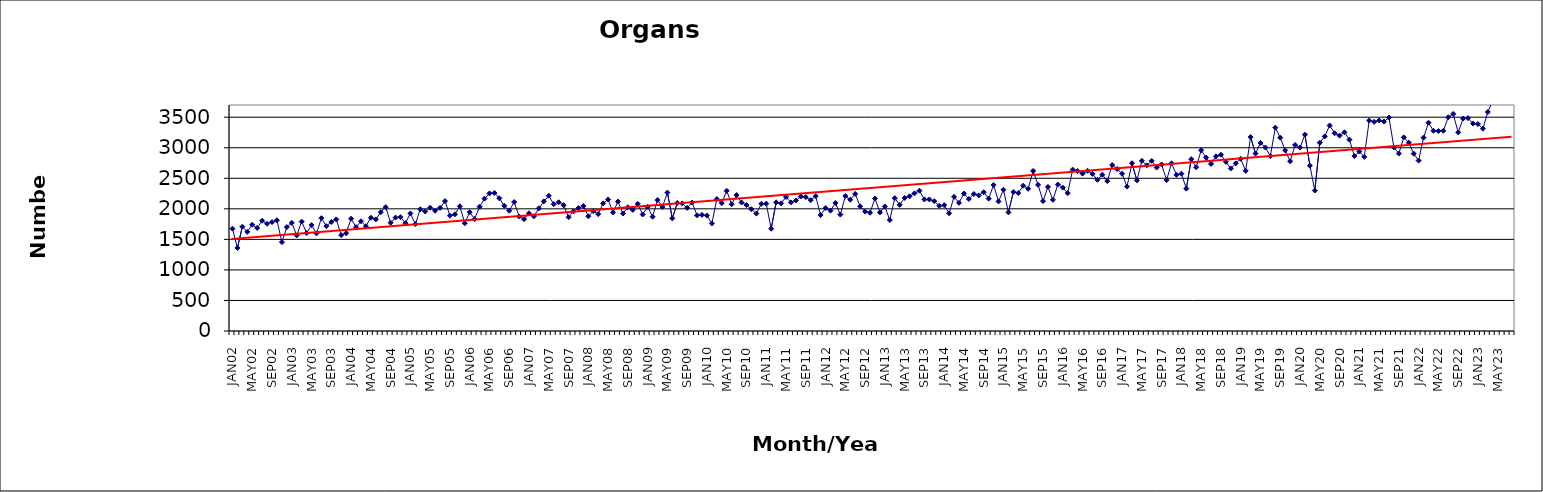
| Category | Series 0 |
|---|---|
| JAN02 | 1675 |
| FEB02 | 1360 |
| MAR02 | 1708 |
| APR02 | 1623 |
| MAY02 | 1740 |
| JUN02 | 1687 |
| JUL02 | 1806 |
| AUG02 | 1755 |
| SEP02 | 1783 |
| OCT02 | 1813 |
| NOV02 | 1455 |
| DEC02 | 1701 |
| JAN03 | 1770 |
| FEB03 | 1565 |
| MAR03 | 1791 |
| APR03 | 1603 |
| MAY03 | 1734 |
| JUN03 | 1598 |
| JUL03 | 1847 |
| AUG03 | 1716 |
| SEP03 | 1785 |
| OCT03 | 1827 |
| NOV03 | 1570 |
| DEC03 | 1602 |
| JAN04 | 1839 |
| FEB04 | 1700 |
| MAR04 | 1797 |
| APR04 | 1715 |
| MAY04 | 1855 |
| JUN04 | 1827 |
| JUL04 | 1945 |
| AUG04 | 2028 |
| SEP04 | 1773 |
| OCT04 | 1857 |
| NOV04 | 1864 |
| DEC04 | 1766 |
| JAN05 | 1925 |
| FEB05 | 1750 |
| MAR05 | 1993 |
| APR05 | 1957 |
| MAY05 | 2018 |
| JUN05 | 1969 |
| JUL05 | 2016 |
| AUG05 | 2127 |
| SEP05 | 1888 |
| OCT05 | 1910 |
| NOV05 | 2042 |
| DEC05 | 1764 |
| JAN06 | 1945 |
| FEB06 | 1834 |
| MAR06 | 2035 |
| APR06 | 2167 |
| MAY06 | 2252 |
| JUN06 | 2261 |
| JUL06 | 2172 |
| AUG06 | 2051 |
| SEP06 | 1969 |
| OCT06 | 2111 |
| NOV06 | 1875 |
| DEC06 | 1832 |
| JAN07 | 1927 |
| FEB07 | 1878 |
| MAR07 | 2009 |
| APR07 | 2122 |
| MAY07 | 2214 |
| JUN07 | 2076 |
| JUL07 | 2108 |
| AUG07 | 2060 |
| SEP07 | 1863 |
| OCT07 | 1959 |
| NOV07 | 2012 |
| DEC07 | 2046 |
| JAN08 | 1878 |
| FEB08 | 1962 |
| MAR08 | 1914 |
| APR08 | 2089 |
| MAY08 | 2153 |
| JUN08 | 1942 |
| JUL08 | 2119 |
| AUG08 | 1923 |
| SEP08 | 2026 |
| OCT08 | 1983 |
| NOV08 | 2082 |
| DEC08 | 1908 |
| JAN09 | 2033 |
| FEB09 | 1871 |
| MAR09 | 2143 |
| APR09 | 2032 |
| MAY09 | 2266 |
| JUN09 | 1844 |
| JUL09 | 2096 |
| AUG09 | 2089 |
| SEP09 | 2016 |
| OCT09 | 2104 |
| NOV09 | 1894 |
| DEC09 | 1901 |
| JAN10 | 1890 |
| FEB10 | 1761 |
| MAR10 | 2160 |
| APR10 | 2094 |
| MAY10 | 2295 |
| JUN10 | 2075 |
| JUL10 | 2226 |
| AUG10 | 2104 |
| SEP10 | 2062 |
| OCT10 | 1994 |
| NOV10 | 1922 |
| DEC10 | 2082 |
| JAN11 | 2085 |
| FEB11 | 1674 |
| MAR11 | 2106 |
| APR11 | 2090 |
| MAY11 | 2194 |
| JUN11 | 2105 |
| JUL11 | 2136 |
| AUG11 | 2202 |
| SEP11 | 2192 |
| OCT11 | 2142 |
| NOV11 | 2207 |
| DEC11 | 1899 |
| JAN12 | 2011 |
| FEB12 | 1970 |
| MAR12 | 2096 |
| APR12 | 1906 |
| MAY12 | 2210 |
| JUN12 | 2150 |
| JUL12 | 2244 |
| AUG12 | 2041 |
| SEP12 | 1954 |
| OCT12 | 1936 |
| NOV12 | 2170 |
| DEC12 | 1941 |
| JAN13 | 2039 |
| FEB13 | 1816 |
| MAR13 | 2175 |
| APR13 | 2065 |
| MAY13 | 2179 |
| JUN13 | 2205 |
| JUL13 | 2254 |
| AUG13 | 2297 |
| SEP13 | 2154 |
| OCT13 | 2154 |
| NOV13 | 2126 |
| DEC13 | 2049 |
| JAN14 | 2061 |
| FEB14 | 1927 |
| MAR14 | 2197 |
| APR14 | 2098 |
| MAY14 | 2251 |
| JUN14 | 2162 |
| JUL14 | 2243 |
| AUG14 | 2220 |
| SEP14 | 2272 |
| OCT14 | 2167 |
| NOV14 | 2391 |
| DEC14 | 2121 |
| JAN15 | 2312 |
| FEB15 | 1942 |
| MAR15 | 2275 |
| APR15 | 2259 |
| MAY15 | 2379 |
| JUN15 | 2328 |
| JUL15 | 2621 |
| AUG15 | 2393 |
| SEP15 | 2127 |
| OCT15 | 2359 |
| NOV15 | 2147 |
| DEC15 | 2398 |
| JAN16 | 2348 |
| FEB16 | 2258 |
| MAR16 | 2642 |
| APR16 | 2619 |
| MAY16 | 2576 |
| JUN16 | 2623 |
| JUL16 | 2573 |
| AUG16 | 2475 |
| SEP16 | 2559 |
| OCT16 | 2455 |
| NOV16 | 2717 |
| DEC16 | 2652 |
| JAN17 | 2574 |
| FEB17 | 2364 |
| MAR17 | 2747 |
| APR17 | 2466 |
| MAY17 | 2786 |
| JUN17 | 2712 |
| JUL17 | 2785 |
| AUG17 | 2676 |
| SEP17 | 2726 |
| OCT17 | 2470 |
| NOV17 | 2745 |
| DEC17 | 2557 |
| JAN18 | 2575 |
| FEB18 | 2331 |
| MAR18 | 2813 |
| APR18 | 2681 |
| MAY18 | 2960 |
| JUN18 | 2839 |
| JUL18 | 2735 |
| AUG18 | 2860 |
| SEP18 | 2886 |
| OCT18 | 2769 |
| NOV18 | 2661 |
| DEC18 | 2745 |
| JAN19 | 2819 |
| FEB19 | 2622 |
| MAR19 | 3175 |
| APR19 | 2906 |
| MAY19 | 3079 |
| JUN19 | 3004 |
| JUL19 | 2863 |
| AUG19 | 3330 |
| SEP19 | 3166 |
| OCT19 | 2958 |
| NOV19 | 2779 |
| DEC19 | 3045 |
| JAN20 | 3002 |
| FEB20 | 3214 |
| MAR20 | 2707 |
| APR20 | 2299 |
| MAY20 | 3082 |
| JUN20 | 3185 |
| JUL20 | 3365 |
| AUG20 | 3238 |
| SEP20 | 3199 |
| OCT20 | 3253 |
| NOV20 | 3133 |
| DEC20 | 2865 |
| JAN21 | 2939 |
| FEB21 | 2850 |
| MAR21 | 3446 |
| APR21 | 3424 |
| MAY21 | 3446 |
| JUN21 | 3429 |
| JUL21 | 3494 |
| AUG21 | 3006 |
| SEP21 | 2905 |
| OCT21 | 3170 |
| NOV21 | 3083 |
| DEC21 | 2903 |
| JAN22 | 2790 |
| FEB22 | 3166 |
| MAR22 | 3410 |
| APR22 | 3278 |
| MAY22 | 3273 |
| JUN22 | 3278 |
| JUL22 | 3499 |
| AUG22 | 3554 |
| SEP22 | 3252 |
| OCT22 | 3478 |
| NOV22 | 3485 |
| DEC22 | 3397 |
| JAN23 | 3388 |
| FEB23 | 3313 |
| MAR23 | 3585 |
| APR23 | 3772 |
| MAY23 | 3909 |
| JUN23 | 3757 |